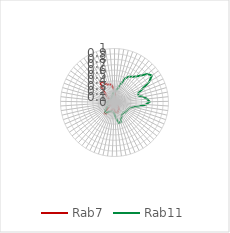
| Category | Rab7 | Rab11 |
|---|---|---|
| 0.0 | 0.223 | 0.191 |
| 0.10913 | 0.132 | 0.213 |
| 0.21825 | 0.062 | 0.24 |
| 0.32738 | 0.03 | 0.29 |
| 0.43651 | 0.033 | 0.381 |
| 0.54563 | 0.025 | 0.501 |
| 0.65476 | 0.035 | 0.553 |
| 0.76389 | 0.018 | 0.579 |
| 0.87302 | 0 | 0.623 |
| 0.98214 | 0.003 | 0.702 |
| 1.09127 | 0.022 | 0.812 |
| 1.2004 | 0.023 | 0.852 |
| 1.30952 | 0.019 | 0.747 |
| 1.41865 | 0.035 | 0.575 |
| 1.52778 | 0.028 | 0.467 |
| 1.6369 | 0.035 | 0.464 |
| 1.74603 | 0.037 | 0.541 |
| 1.85516 | 0.031 | 0.609 |
| 1.96429 | 0.016 | 0.651 |
| 2.07341 | 0.024 | 0.584 |
| 2.18254 | 0.002 | 0.469 |
| 2.29167 | 0.014 | 0.369 |
| 2.40079 | 0.037 | 0.297 |
| 2.50992 | 0.03 | 0.285 |
| 2.61905 | 0.018 | 0.274 |
| 2.72817 | 0.041 | 0.274 |
| 2.8373 | 0.062 | 0.268 |
| 2.94643 | 0.08 | 0.27 |
| 3.05556 | 0.09 | 0.251 |
| 3.16468 | 0.124 | 0.262 |
| 3.27381 | 0.149 | 0.26 |
| 3.38294 | 0.137 | 0.285 |
| 3.49206 | 0.171 | 0.331 |
| 3.60119 | 0.193 | 0.38 |
| 3.71032 | 0.198 | 0.387 |
| 3.81944 | 0.175 | 0.319 |
| 3.92857 | 0.166 | 0.247 |
| 4.0377 | 0.128 | 0.195 |
| 4.14683 | 0.112 | 0.188 |
| 4.25595 | 0.12 | 0.167 |
| 4.36508 | 0.129 | 0.173 |
| 4.47421 | 0.16 | 0.175 |
| 4.58333 | 0.161 | 0.184 |
| 4.69246 | 0.201 | 0.209 |
| 4.80159 | 0.261 | 0.235 |
| 4.91071 | 0.269 | 0.252 |
| 5.01984 | 0.229 | 0.253 |
| 5.12897 | 0.141 | 0.217 |
| 5.2381 | 0.098 | 0.175 |
| 5.34722 | 0.053 | 0.147 |
| 5.45635 | 0.017 | 0.138 |
| 5.56548 | 0.026 | 0.124 |
| 5.6746 | 0.034 | 0.121 |
| 5.78373 | 0.023 | 0.119 |
| 5.89286 | 0.046 | 0.125 |
| 6.00198 | 0.061 | 0.135 |
| 6.11111 | 0.07 | 0.122 |
| 6.22024 | 0.083 | 0.109 |
| 6.32937 | 0.083 | 0.1 |
| 6.43849 | 0.087 | 0.089 |
| 6.54762 | 0.092 | 0.084 |
| 6.65675 | 0.121 | 0.081 |
| 6.76587 | 0.135 | 0.077 |
| 6.875 | 0.193 | 0.079 |
| 6.98413 | 0.269 | 0.096 |
| 7.09325 | 0.376 | 0.096 |
| 7.20238 | 0.452 | 0.1 |
| 7.31151 | 0.435 | 0.103 |
| 7.42063 | 0.374 | 0.106 |
| 7.52976 | 0.351 | 0.121 |
| 7.63889 | 0.349 | 0.14 |
| 7.74802 | 0.33 | 0.172 |
| 7.85714 | 0.263 | 0.188 |